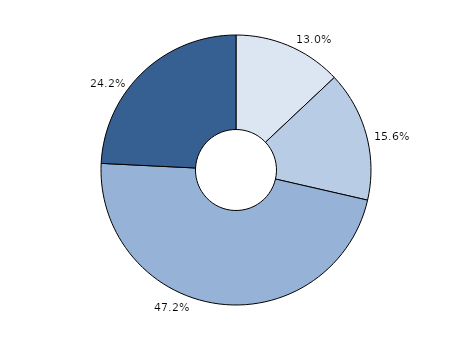
| Category | Series 0 |
|---|---|
| Akute Kindeswohlgefährdung | 452 |
| Latente Kindeswohlgefährdung | 543 |
| Keine Kindeswohlgefährdung, aber Hilfe/ Unterstützungsbedarf | 1643 |
| Keine Kindeswohlgefährdung und kein Hilfebedarf | 843 |